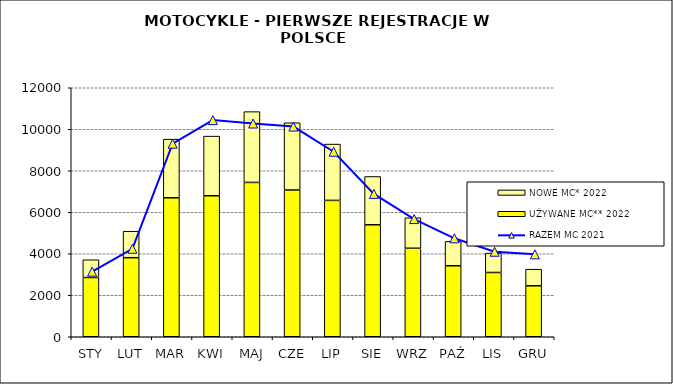
| Category | UŻYWANE MC** 2022 | NOWE MC* 2022 |
|---|---|---|
| STY | 2855 | 856 |
| LUT | 3810 | 1276 |
| MAR | 6696 | 2828 |
| KWI | 6795 | 2875 |
| MAJ | 7438 | 3412 |
| CZE | 7071 | 3241 |
| LIP | 6571 | 2715 |
| SIE | 5398 | 2326 |
| WRZ | 4265 | 1469 |
| PAŹ | 3421 | 1176 |
| LIS | 3097 | 936 |
| GRU | 2456 | 800 |